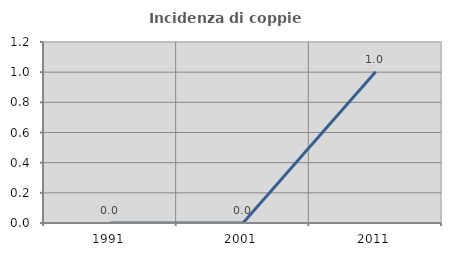
| Category | Incidenza di coppie miste |
|---|---|
| 1991.0 | 0 |
| 2001.0 | 0 |
| 2011.0 | 1.003 |